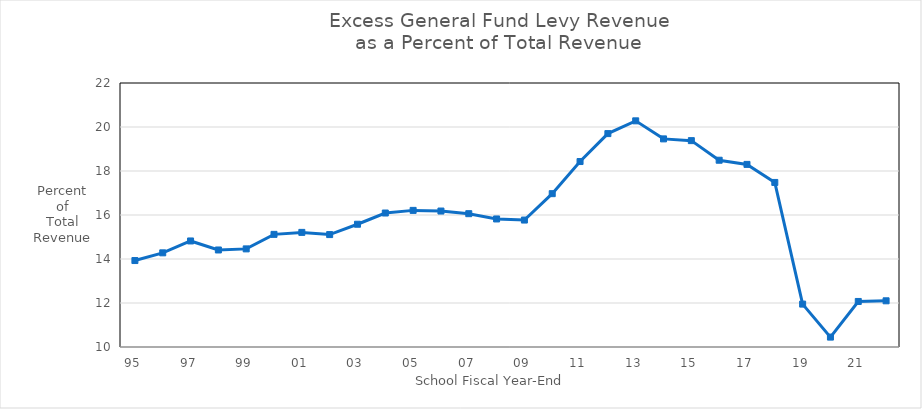
| Category | Percent |
|---|---|
| 95 | 13.93 |
| 96 | 14.28 |
| 97 | 14.82 |
| 98 | 14.41 |
| 99 | 14.46 |
| 00 | 15.12 |
| 01 | 15.21 |
| 02 | 15.11 |
| 03 | 15.58 |
| 04 | 16.09 |
| 05 | 16.21 |
| 06 | 16.18 |
| 07 | 16.06 |
| 08 | 15.82 |
| 09 | 15.77 |
| 10 | 16.97 |
| 11 | 18.43 |
| 12 | 19.7 |
| 13 | 20.28 |
| 14 | 19.46 |
| 15 | 19.38 |
| 16 | 18.49 |
| 17 | 18.3 |
| 18 | 17.48 |
| 19 | 11.95 |
| 20 | 10.45 |
| 21 | 12.07 |